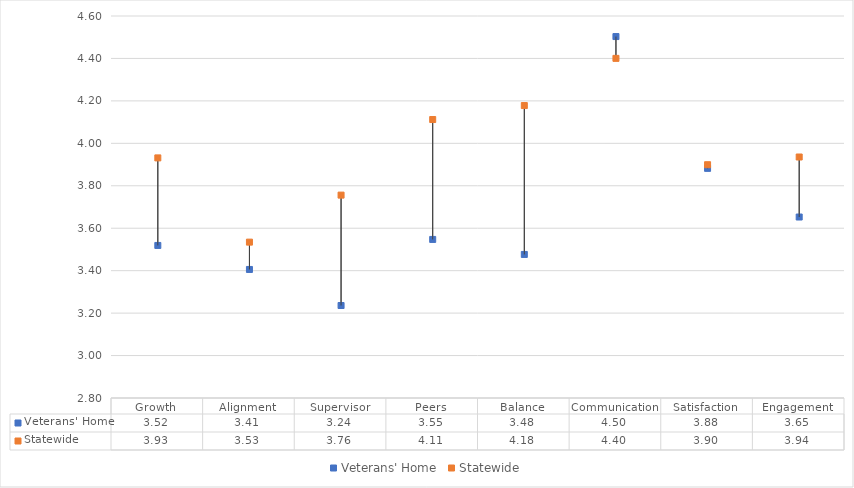
| Category | Veterans' Home | Statewide |
|---|---|---|
| Growth | 3.519 | 3.931 |
| Alignment | 3.406 | 3.534 |
| Supervisor | 3.236 | 3.756 |
| Peers | 3.547 | 4.112 |
| Balance | 3.476 | 4.178 |
| Communication | 4.503 | 4.4 |
| Satisfaction | 3.882 | 3.899 |
| Engagement | 3.653 | 3.936 |